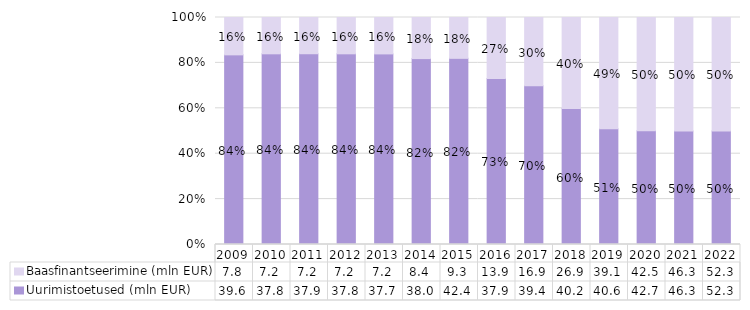
| Category | Uurimistoetused (mln EUR) | Baasfinantseerimine (mln EUR) |
|---|---|---|
| 2009.0 | 39.6 | 7.8 |
| 2010.0 | 37.8 | 7.2 |
| 2011.0 | 37.9 | 7.2 |
| 2012.0 | 37.8 | 7.2 |
| 2013.0 | 37.7 | 7.2 |
| 2014.0 | 38 | 8.4 |
| 2015.0 | 42.4 | 9.3 |
| 2016.0 | 37.9 | 13.9 |
| 2017.0 | 39.4 | 16.9 |
| 2018.0 | 40.2 | 26.9 |
| 2019.0 | 40.6 | 39.1 |
| 2020.0 | 42.7 | 42.5 |
| 2021.0 | 46.3 | 46.3 |
| 2022.0 | 52.3 | 52.3 |